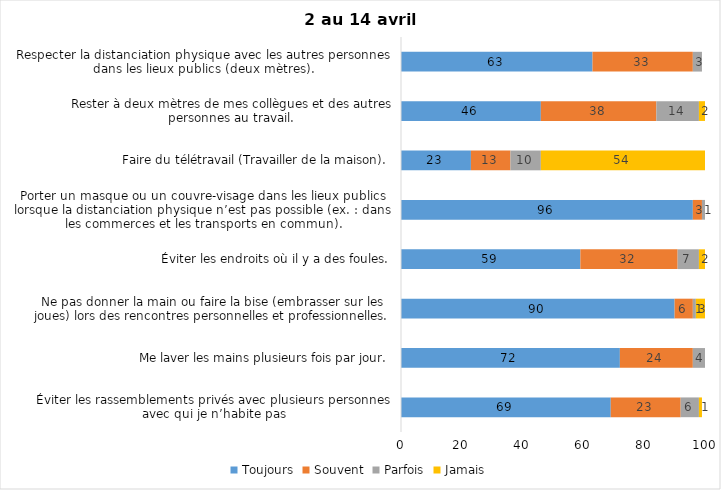
| Category | Toujours | Souvent | Parfois | Jamais |
|---|---|---|---|---|
| Éviter les rassemblements privés avec plusieurs personnes avec qui je n’habite pas | 69 | 23 | 6 | 1 |
| Me laver les mains plusieurs fois par jour. | 72 | 24 | 4 | 0 |
| Ne pas donner la main ou faire la bise (embrasser sur les joues) lors des rencontres personnelles et professionnelles. | 90 | 6 | 1 | 3 |
| Éviter les endroits où il y a des foules. | 59 | 32 | 7 | 2 |
| Porter un masque ou un couvre-visage dans les lieux publics lorsque la distanciation physique n’est pas possible (ex. : dans les commerces et les transports en commun). | 96 | 3 | 1 | 0 |
| Faire du télétravail (Travailler de la maison). | 23 | 13 | 10 | 54 |
| Rester à deux mètres de mes collègues et des autres personnes au travail. | 46 | 38 | 14 | 2 |
| Respecter la distanciation physique avec les autres personnes dans les lieux publics (deux mètres). | 63 | 33 | 3 | 0 |